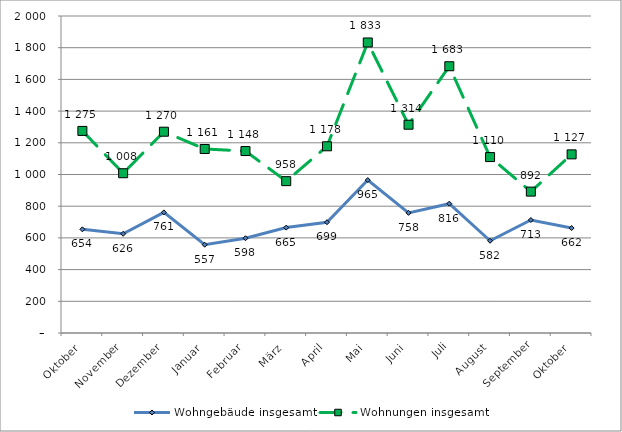
| Category | Wohngebäude insgesamt | Wohnungen insgesamt |
|---|---|---|
| Oktober | 654 | 1275 |
| November | 626 | 1008 |
| Dezember | 761 | 1270 |
| Januar | 557 | 1161 |
| Februar | 598 | 1148 |
| März | 665 | 958 |
| April | 699 | 1178 |
| Mai | 965 | 1833 |
| Juni | 758 | 1314 |
| Juli | 816 | 1683 |
| August | 582 | 1110 |
| September | 713 | 892 |
| Oktober | 662 | 1127 |